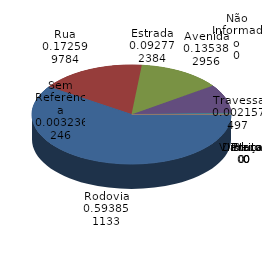
| Category | Qtde Acidentes |
|---|---|
| Rodovia | 1101 |
| Rua | 320 |
| Avenida | 251 |
| Estrada | 172 |
| Sem Referência | 6 |
| Travessa | 4 |
| Beco | 0 |
| Distrito | 0 |
| Não Informado | 0 |
| Praca | 0 |
| Praça | 0 |
| Viaduto | 0 |